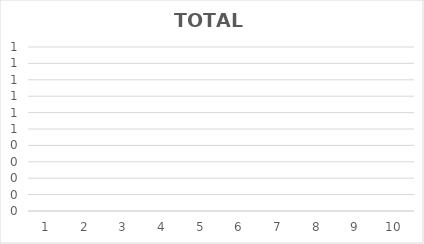
| Category | TOTAL  Revenue |
|---|---|
| 0 | 0 |
| 1 | 0 |
| 2 | 0 |
| 3 | 0 |
| 4 | 0 |
| 5 | 0 |
| 6 | 0 |
| 7 | 0 |
| 8 | 0 |
| 9 | 0 |